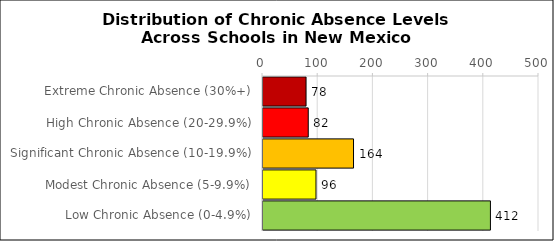
| Category | Number of Schools |
|---|---|
| Extreme Chronic Absence (30%+) | 78 |
| High Chronic Absence (20-29.9%) | 82 |
| Significant Chronic Absence (10-19.9%) | 164 |
| Modest Chronic Absence (5-9.9%) | 96 |
| Low Chronic Absence (0-4.9%) | 412 |